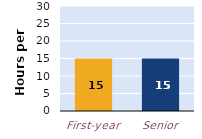
| Category | hours per week |
|---|---|
| First-year | 15 |
| Senior | 15 |